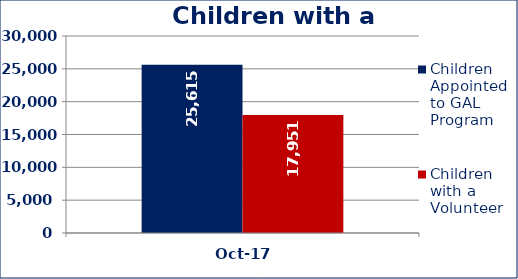
| Category | Children Appointed to GAL Program  | Children with a Volunteer  |
|---|---|---|
| Oct-17 | 25615 | 17951 |